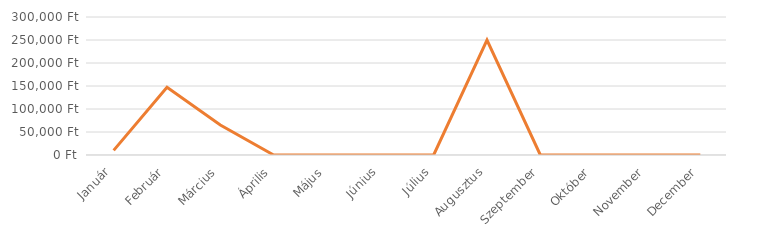
| Category | Series 0 |
|---|---|
| Január | 10000 |
| Február | 147000 |
| Március | 65231 |
| Április | 0 |
| Május | 0 |
| Június | 0 |
| Július | 0 |
| Augusztus | 250000 |
| Szeptember | 0 |
| Október | 0 |
| November | 0 |
| December | 0 |